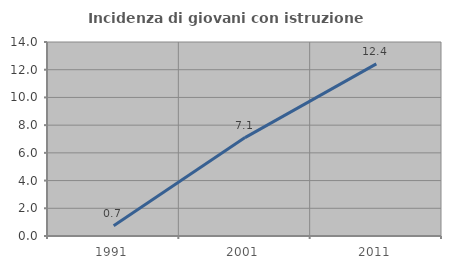
| Category | Incidenza di giovani con istruzione universitaria |
|---|---|
| 1991.0 | 0.746 |
| 2001.0 | 7.101 |
| 2011.0 | 12.422 |